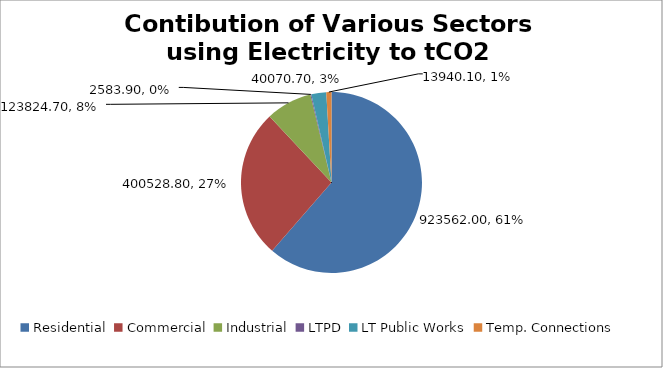
| Category | Contribution |
|---|---|
| Residential | 923562 |
| Commercial | 400528.8 |
| Industrial | 123824.7 |
| LTPD | 2583.9 |
| LT Public Works | 40070.7 |
| Temp. Connections | 13940.1 |